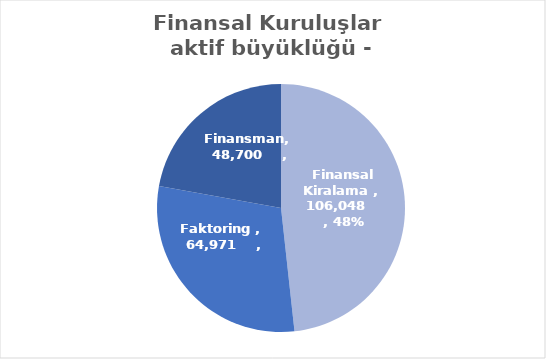
| Category | Series 0 |
|---|---|
| Finansal Kiralama  | 106048 |
| Faktoring  | 64971 |
| Finansman | 48700 |